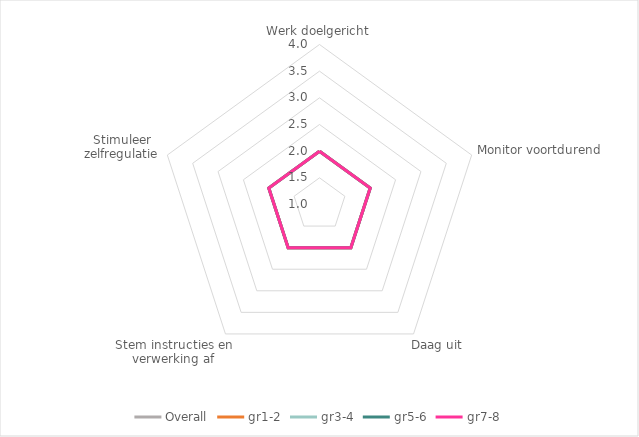
| Category | Overall | gr1-2 | gr3-4 | gr5-6 | gr7-8 |
|---|---|---|---|---|---|
| Werk doelgericht | 0 | 0 | 0 | 0 | 0 |
| Monitor voortdurend | 0 | 0 | 0 | 0 | 0 |
| Daag uit | 0 | 0 | 0 | 0 | 0 |
| Stem instructies en verwerking af | 0 | 0 | 0 | 0 | 0 |
| Stimuleer zelfregulatie | 0 | 0 | 0 | 0 | 0 |